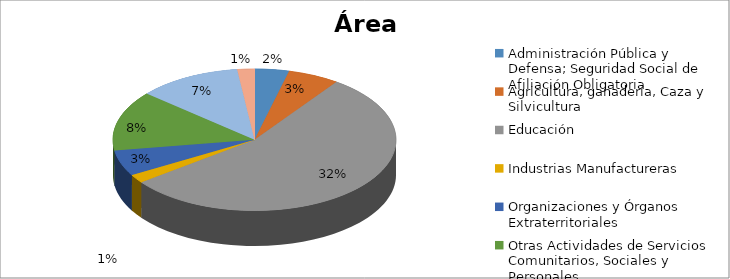
| Category | Series 0 |
|---|---|
| Administración Pública y Defensa; Seguridad Social de Afiliación Obligatoria | 0.023 |
| Agricultura, ganadería, Caza y Silvicultura | 0.034 |
| Educación | 0.322 |
| Industrias Manufactureras | 0.011 |
| Organizaciones y Órganos Extraterritoriales | 0.034 |
| Otras Actividades de Servicios Comunitarios, Sociales y Personales | 0.08 |
| Servicios Sociales y de Salud | 0.069 |
| Transporte, Almacenamiento y Comunicaciones | 0.011 |